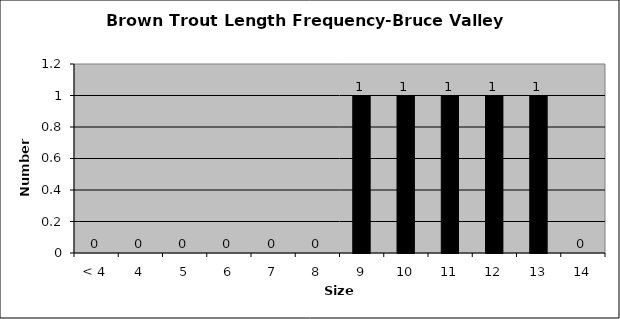
| Category | Series 0 |
|---|---|
| < 4 | 0 |
| 4 | 0 |
| 5 | 0 |
| 6 | 0 |
| 7 | 0 |
| 8 | 0 |
| 9 | 1 |
| 10 | 1 |
| 11 | 1 |
| 12 | 1 |
| 13 | 1 |
| 14 | 0 |